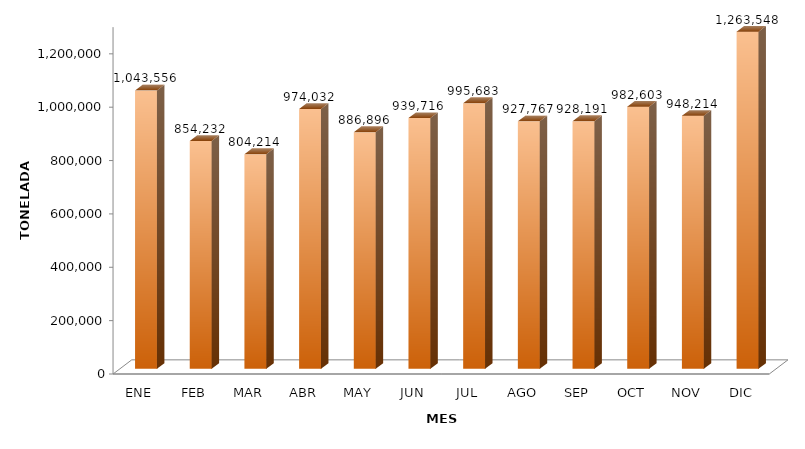
| Category | Series 0 |
|---|---|
| ENE | 1043556.263 |
| FEB | 854232.265 |
| MAR | 804213.92 |
| ABR | 974032.436 |
| MAY | 886895.58 |
| JUN | 939715.504 |
| JUL | 995682.863 |
| AGO | 927766.622 |
| SEP | 928191.13 |
| OCT | 982602.581 |
| NOV | 948214.232 |
| DIC | 1263548.274 |